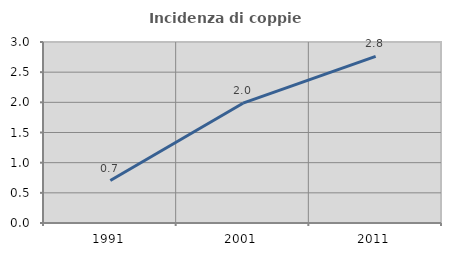
| Category | Incidenza di coppie miste |
|---|---|
| 1991.0 | 0.704 |
| 2001.0 | 1.986 |
| 2011.0 | 2.762 |